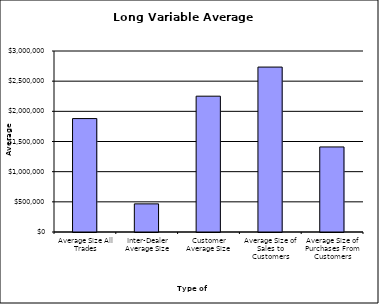
| Category | Security Type |
|---|---|
| Average Size All Trades | 1879954.521 |
| Inter-Dealer Average Size | 466175.234 |
| Customer Average Size | 2251180.003 |
| Average Size of Sales to Customers | 2733581.472 |
| Average Size of Purchases From Customers | 1409819.865 |